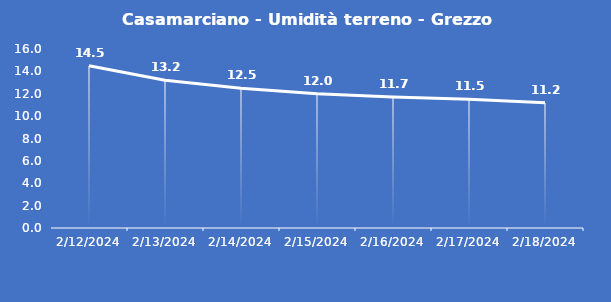
| Category | Casamarciano - Umidità terreno - Grezzo (%VWC) |
|---|---|
| 2/12/24 | 14.5 |
| 2/13/24 | 13.2 |
| 2/14/24 | 12.5 |
| 2/15/24 | 12 |
| 2/16/24 | 11.7 |
| 2/17/24 | 11.5 |
| 2/18/24 | 11.2 |